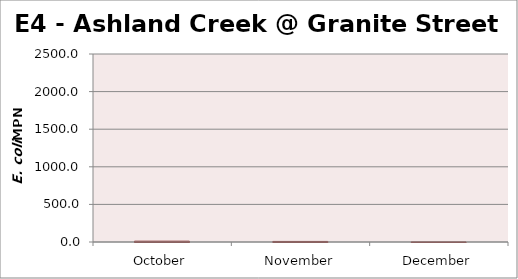
| Category | Series 0 |
|---|---|
| October | 10.9 |
| November | 7.4 |
| December | 1 |